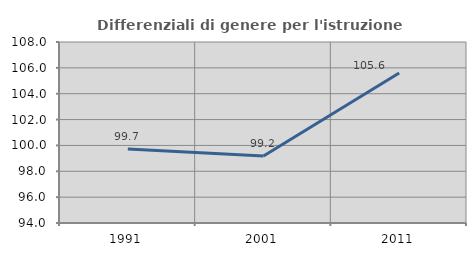
| Category | Differenziali di genere per l'istruzione superiore |
|---|---|
| 1991.0 | 99.715 |
| 2001.0 | 99.187 |
| 2011.0 | 105.603 |